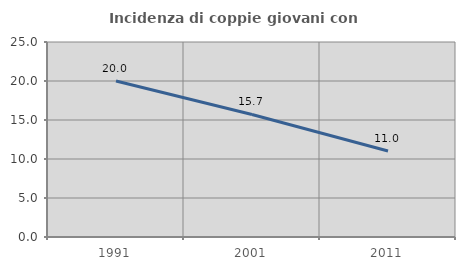
| Category | Incidenza di coppie giovani con figli |
|---|---|
| 1991.0 | 20 |
| 2001.0 | 15.714 |
| 2011.0 | 11.024 |